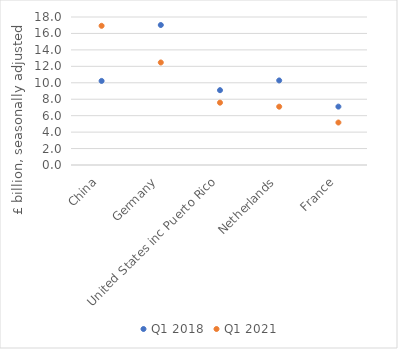
| Category | Q1 2018 | Q1 2021 |
|---|---|---|
| China | 10.224 | 16.928 |
| Germany | 17.025 | 12.468 |
| United States inc Puerto Rico | 9.099 | 7.582 |
| Netherlands | 10.283 | 7.093 |
| France | 7.1 | 5.166 |